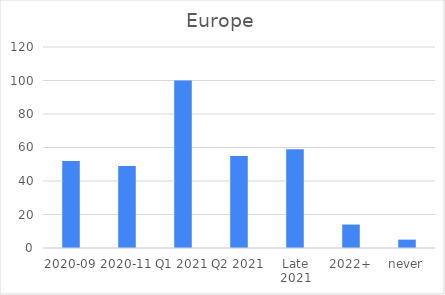
| Category | Series 0 |
|---|---|
| 2020-09 | 52 |
| 2020-11 | 49 |
| Q1 2021 | 100 |
| Q2 2021 | 55 |
| Late 2021 | 59 |
| 2022+ | 14 |
| never | 5 |